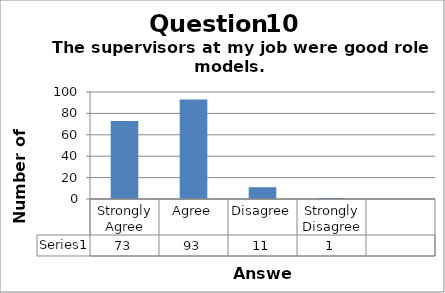
| Category | Series 0 |
|---|---|
| Strongly Agree | 73 |
| Agree | 93 |
| Disagree | 11 |
| Strongly Disagree | 1 |